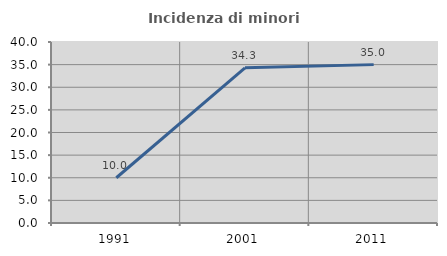
| Category | Incidenza di minori stranieri |
|---|---|
| 1991.0 | 10 |
| 2001.0 | 34.286 |
| 2011.0 | 35 |